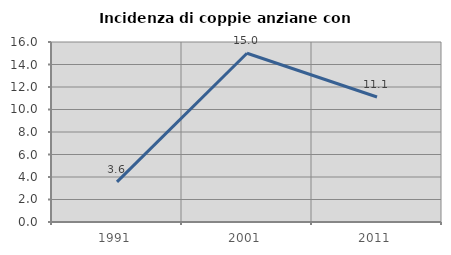
| Category | Incidenza di coppie anziane con figli |
|---|---|
| 1991.0 | 3.571 |
| 2001.0 | 15 |
| 2011.0 | 11.111 |